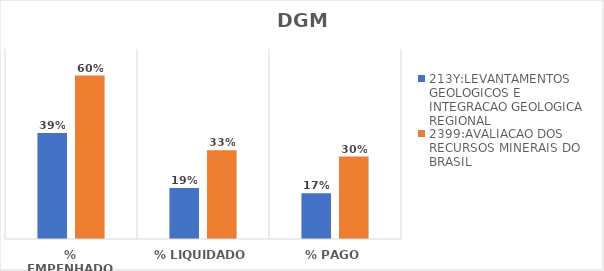
| Category | 213Y:LEVANTAMENTOS GEOLOGICOS E INTEGRACAO GEOLOGICA REGIONAL | 2399:AVALIACAO DOS RECURSOS MINERAIS DO BRASIL |
|---|---|---|
| % EMPENHADO | 0.391 | 0.602 |
| % LIQUIDADO | 0.188 | 0.327 |
| % PAGO | 0.168 | 0.304 |